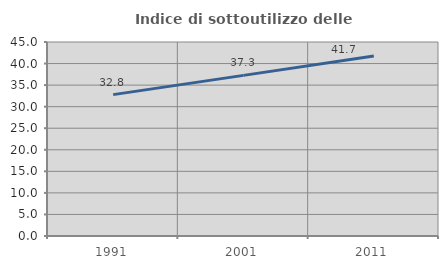
| Category | Indice di sottoutilizzo delle abitazioni  |
|---|---|
| 1991.0 | 32.792 |
| 2001.0 | 37.261 |
| 2011.0 | 41.732 |